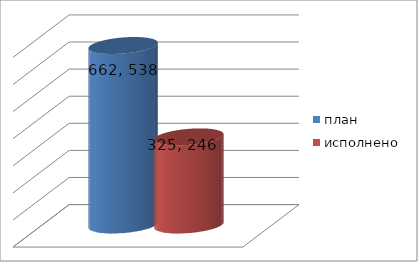
| Category | план | исполнено |
|---|---|---|
| 0 | 662538539.29 | 325246769.28 |